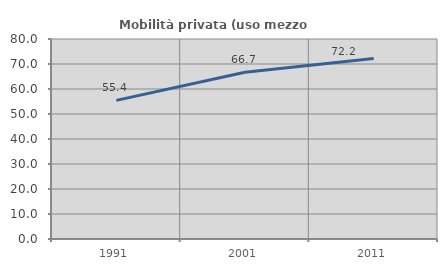
| Category | Mobilità privata (uso mezzo privato) |
|---|---|
| 1991.0 | 55.438 |
| 2001.0 | 66.728 |
| 2011.0 | 72.153 |